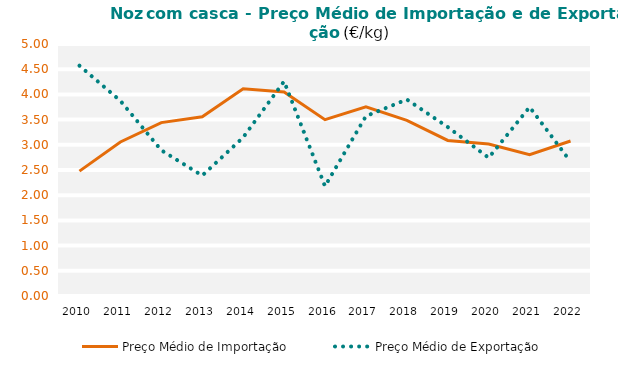
| Category | Preço Médio de Importação | Preço Médio de Exportação |
|---|---|---|
| 2010.0 | 2.478 | 4.57 |
| 2011.0 | 3.055 | 3.873 |
| 2012.0 | 3.441 | 2.891 |
| 2013.0 | 3.557 | 2.389 |
| 2014.0 | 4.111 | 3.146 |
| 2015.0 | 4.046 | 4.259 |
| 2016.0 | 3.498 | 2.179 |
| 2017.0 | 3.755 | 3.568 |
| 2018.0 | 3.485 | 3.899 |
| 2019.0 | 3.087 | 3.352 |
| 2020.0 | 3.016 | 2.742 |
| 2021.0 | 2.802 | 3.749 |
| 2022.0 | 3.076 | 2.666 |